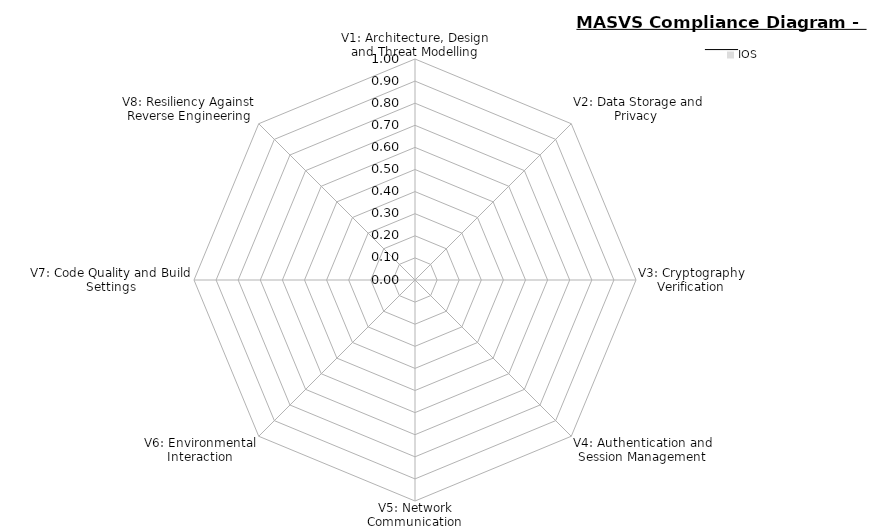
| Category | IOS |
|---|---|
| V1: Architecture, Design and Threat Modelling | 0 |
| V2: Data Storage and Privacy  | 0 |
| V3: Cryptography Verification | 0 |
| V4: Authentication and Session Management | 0 |
| V5: Network Communication | 0 |
| V6: Environmental Interaction | 0 |
| V7: Code Quality and Build Settings | 0 |
| V8: Resiliency Against Reverse Engineering | 0 |